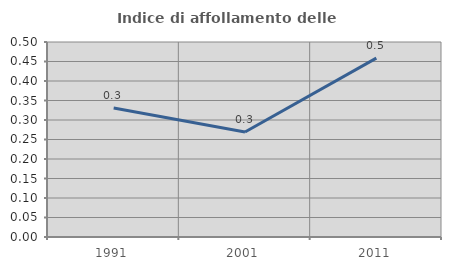
| Category | Indice di affollamento delle abitazioni  |
|---|---|
| 1991.0 | 0.331 |
| 2001.0 | 0.269 |
| 2011.0 | 0.459 |